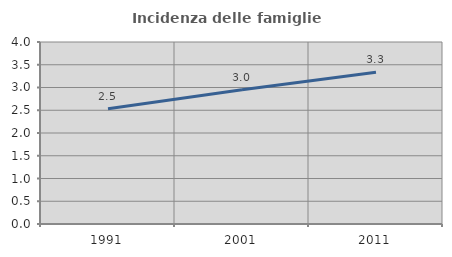
| Category | Incidenza delle famiglie numerose |
|---|---|
| 1991.0 | 2.532 |
| 2001.0 | 2.951 |
| 2011.0 | 3.333 |